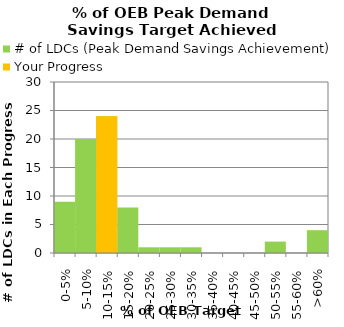
| Category | # of LDCs (Peak Demand Savings Achievement) | Your Progress |
|---|---|---|
| 0-5% | 9 | 0 |
| 5-10% | 20 | 0 |
| 10-15% | 24 | 24 |
| 15-20% | 8 | 0 |
| 20-25% | 1 | 0 |
| 25-30% | 1 | 0 |
| 30-35% | 1 | 0 |
| 35-40% | 0 | 0 |
| 40-45% | 0 | 0 |
| 45-50% | 0 | 0 |
| 50-55% | 2 | 0 |
| 55-60% | 0 | 0 |
| >60% | 4 | 0 |